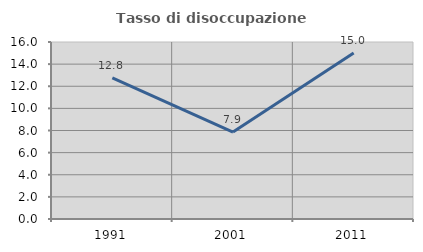
| Category | Tasso di disoccupazione giovanile  |
|---|---|
| 1991.0 | 12.755 |
| 2001.0 | 7.857 |
| 2011.0 | 15 |